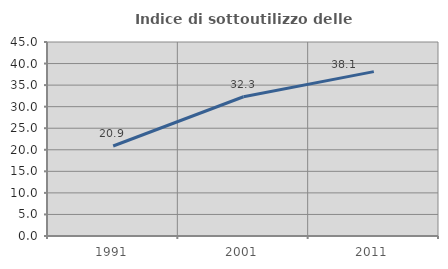
| Category | Indice di sottoutilizzo delle abitazioni  |
|---|---|
| 1991.0 | 20.882 |
| 2001.0 | 32.297 |
| 2011.0 | 38.127 |